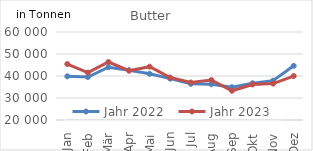
| Category | Jahr 2022 | Jahr 2023 |
|---|---|---|
| Jan | 39846.204 | 45428.896 |
| Feb | 39542.411 | 41531.135 |
| Mär | 43978.369 | 46357.808 |
| Apr | 42626.76 | 42410.145 |
| Mai | 40984.171 | 44235.79 |
| Jun | 38796.251 | 39297.154 |
| Jul | 36443.336 | 37056.109 |
| Aug | 36250.592 | 38185.04 |
| Sep | 34907.701 | 33282.218 |
| Okt | 36702.357 | 36157.291 |
| Nov | 37881.435 | 36547.136 |
| Dez | 44619.818 | 39981.775 |